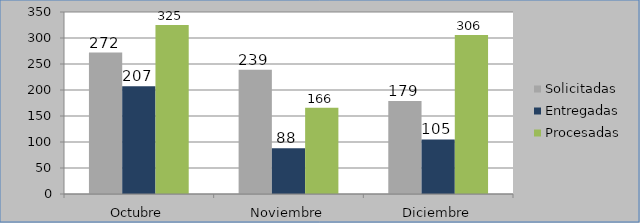
| Category | Solicitadas | Entregadas | Procesadas |
|---|---|---|---|
| Octubre | 272 | 207 | 325 |
| Noviembre | 239 | 88 | 166 |
| Diciembre | 179 | 105 | 306 |